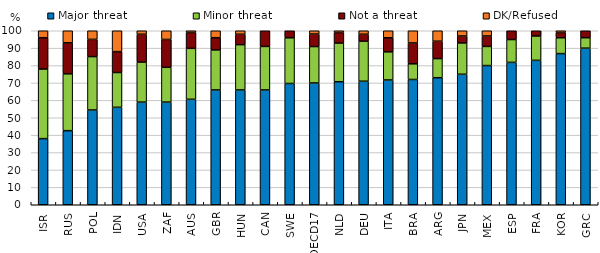
| Category | Major threat | Minor threat | Not a threat | DK/Refused |
|---|---|---|---|---|
| ISR | 38 | 40 | 18 | 4 |
| RUS | 42.574 | 32.673 | 17.822 | 6.931 |
| POL | 54.455 | 30.693 | 9.901 | 4.95 |
| IDN | 56 | 20 | 12 | 12 |
| USA | 59 | 23 | 16 | 2 |
| ZAF | 59 | 20 | 16 | 5 |
| AUS | 60.606 | 29.293 | 9.091 | 1.01 |
| GBR | 66 | 23 | 7 | 4 |
| HUN | 66 | 26 | 6 | 2 |
| CAN | 66 | 25 | 9 | 0 |
| SWE | 69.697 | 26.263 | 4.04 | 0 |
| OECD17 | 69.992 | 20.933 | 7.191 | 1.884 |
| NLD | 70.707 | 22.222 | 6.061 | 1.01 |
| DEU | 71 | 23 | 4 | 2 |
| ITA | 71.717 | 16.162 | 8.081 | 4.04 |
| BRA | 72 | 9 | 12 | 7 |
| ARG | 73 | 11 | 10 | 6 |
| JPN | 75 | 18 | 4 | 3 |
| MEX | 80 | 11 | 6 | 3 |
| ESP | 81.818 | 13.131 | 5.051 | 0 |
| FRA | 83 | 14 | 3 | 0 |
| KOR | 86.869 | 9.091 | 3.03 | 1.01 |
| GRC | 90 | 6 | 4 | 0 |